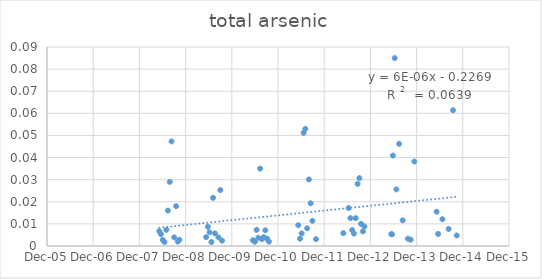
| Category | Series 0 |
|---|---|
| 39577.0 | 0.007 |
| 39590.0 | 0.005 |
| 39604.0 | 0.003 |
| 39618.0 | 0.002 |
| 39633.0 | 0.007 |
| 39645.0 | 0.016 |
| 39660.0 | 0.029 |
| 39674.0 | 0.047 |
| 39695.0 | 0.004 |
| 39710.0 | 0.018 |
| 39723.0 | 0.002 |
| 39736.0 | 0.003 |
| 39947.0 | 0.004 |
| 39961.0 | 0.009 |
| 39974.0 | 0.006 |
| 39989.0 | 0.002 |
| 40002.0 | 0.022 |
| 40017.0 | 0.006 |
| 40045.0 | 0.004 |
| 40059.0 | 0.025 |
| 40073.0 | 0.002 |
| 40317.0 | 0.003 |
| 40332.0 | 0.002 |
| 40346.0 | 0.007 |
| 40359.0 | 0.004 |
| 40374.0 | 0.035 |
| 40388.0 | 0.003 |
| 40402.0 | 0.004 |
| 40415.0 | 0.007 |
| 40429.0 | 0.003 |
| 40443.0 | 0.002 |
| 40675.0 | 0.009 |
| 40689.0 | 0.003 |
| 40702.0 | 0.006 |
| 40717.0 | 0.051 |
| 40731.0 | 0.053 |
| 40745.0 | 0.008 |
| 40759.0 | 0.03 |
| 40773.0 | 0.019 |
| 40787.0 | 0.011 |
| 40815.0 | 0.003 |
| 41031.0 | 0.006 |
| 41073.0 | 0.017 |
| 41087.0 | 0.013 |
| 41101.0 | 0.007 |
| 41115.0 | 0.006 |
| 41129.0 | 0.013 |
| 41144.0 | 0.028 |
| 41158.0 | 0.031 |
| 41171.0 | 0.01 |
| 41186.0 | 0.007 |
| 41198.0 | 0.009 |
| 41410.0 | 0.005 |
| 41416.0 | 0.005 |
| 41423.0 | 0.041 |
| 41437.0 | 0.085 |
| 41450.0 | 0.026 |
| 41472.0 | 0.046 |
| 41500.0 | 0.012 |
| 41541.0 | 0.003 |
| 41563.0 | 0.003 |
| 41592.0 | 0.038 |
| 41768.0 | 0.016 |
| 41780.0 | 0.005 |
| 41814.0 | 0.012 |
| 41863.0 | 0.008 |
| 41898.0 | 0.061 |
| 41927.0 | 0.005 |